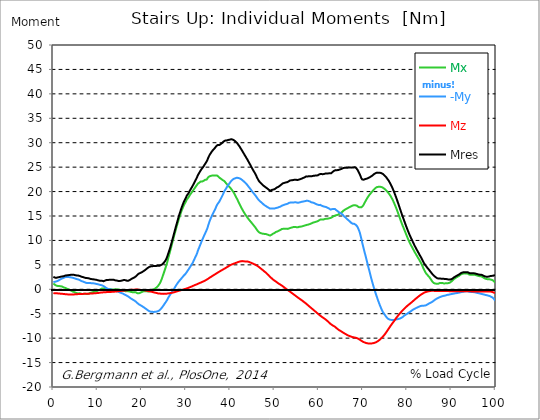
| Category |  Mx |  -My |  Mz |  Mres |
|---|---|---|---|---|
| 0.0 | 1.2 | 1.5 | -0.78 | 2.56 |
| 0.16678370786516855 | 1.06 | 1.51 | -0.78 | 2.47 |
| 0.3335674157303371 | 0.94 | 1.52 | -0.8 | 2.39 |
| 0.5003511235955057 | 0.83 | 1.56 | -0.81 | 2.36 |
| 0.6671348314606742 | 0.75 | 1.62 | -0.82 | 2.35 |
| 0.8339185393258427 | 0.7 | 1.66 | -0.83 | 2.38 |
| 1.0007022471910114 | 0.68 | 1.72 | -0.84 | 2.43 |
| 1.1674859550561796 | 0.67 | 1.79 | -0.85 | 2.46 |
| 1.3342696629213484 | 0.66 | 1.89 | -0.87 | 2.5 |
| 1.5010533707865168 | 0.65 | 2 | -0.89 | 2.54 |
| 1.6678370786516854 | 0.62 | 2.08 | -0.9 | 2.57 |
| 1.8346207865168538 | 0.6 | 2.15 | -0.92 | 2.6 |
| 2.001404494382023 | 0.56 | 2.22 | -0.93 | 2.63 |
| 2.1681882022471908 | 0.47 | 2.28 | -0.95 | 2.64 |
| 2.334971910112359 | 0.38 | 2.35 | -0.96 | 2.67 |
| 2.501755617977528 | 0.36 | 2.43 | -0.98 | 2.76 |
| 2.668539325842697 | 0.29 | 2.48 | -1 | 2.8 |
| 2.8353230337078656 | 0.2 | 2.51 | -1.02 | 2.83 |
| 3.0021067415730336 | 0.14 | 2.52 | -1.03 | 2.85 |
| 3.168890449438202 | 0.09 | 2.52 | -1.04 | 2.86 |
| 3.335674157303371 | 0.03 | 2.52 | -1.05 | 2.89 |
| 3.502457865168539 | -0.03 | 2.51 | -1.06 | 2.91 |
| 3.6692415730337076 | -0.11 | 2.48 | -1.07 | 2.92 |
| 3.8360252808988764 | -0.2 | 2.45 | -1.07 | 2.94 |
| 4.002808988764046 | -0.28 | 2.43 | -1.08 | 2.97 |
| 4.169592696629214 | -0.37 | 2.4 | -1.08 | 2.97 |
| 4.3363764044943816 | -0.45 | 2.37 | -1.07 | 2.97 |
| 4.50316011235955 | -0.51 | 2.33 | -1.06 | 2.98 |
| 4.669943820224718 | -0.55 | 2.28 | -1.05 | 2.96 |
| 4.836727528089888 | -0.59 | 2.21 | -1.03 | 2.91 |
| 5.003511235955056 | -0.68 | 2.16 | -1.02 | 2.87 |
| 5.170294943820225 | -0.76 | 2.12 | -1.01 | 2.84 |
| 5.337078651685394 | -0.81 | 2.08 | -1 | 2.83 |
| 5.5038623595505625 | -0.85 | 2.05 | -0.99 | 2.82 |
| 5.670646067415731 | -0.84 | 2 | -0.98 | 2.8 |
| 5.837429775280899 | -0.8 | 1.95 | -0.98 | 2.76 |
| 6.004213483146067 | -0.83 | 1.86 | -0.98 | 2.71 |
| 6.170997191011236 | -0.88 | 1.76 | -0.96 | 2.63 |
| 6.329002808988764 | -0.92 | 1.69 | -0.96 | 2.58 |
| 6.495786516853932 | -0.95 | 1.65 | -0.95 | 2.55 |
| 6.662570224719101 | -0.98 | 1.59 | -0.94 | 2.51 |
| 6.82935393258427 | -0.96 | 1.53 | -0.93 | 2.46 |
| 6.9961376404494375 | -0.92 | 1.47 | -0.93 | 2.4 |
| 7.162921348314607 | -0.9 | 1.41 | -0.92 | 2.35 |
| 7.329705056179775 | -0.93 | 1.34 | -0.91 | 2.31 |
| 7.496488764044945 | -0.97 | 1.27 | -0.91 | 2.29 |
| 7.663272471910113 | -0.96 | 1.27 | -0.9 | 2.29 |
| 7.830056179775281 | -0.93 | 1.26 | -0.9 | 2.27 |
| 7.996839887640449 | -0.89 | 1.27 | -0.9 | 2.25 |
| 8.16362359550562 | -0.8 | 1.27 | -0.89 | 2.18 |
| 8.330407303370787 | -0.74 | 1.27 | -0.88 | 2.14 |
| 8.497191011235955 | -0.69 | 1.26 | -0.87 | 2.11 |
| 8.663974719101123 | -0.65 | 1.25 | -0.86 | 2.08 |
| 8.830758426966291 | -0.61 | 1.24 | -0.85 | 2.06 |
| 8.99754213483146 | -0.57 | 1.23 | -0.84 | 2.05 |
| 9.16432584269663 | -0.52 | 1.21 | -0.83 | 2.01 |
| 9.331109550561798 | -0.49 | 1.18 | -0.82 | 1.99 |
| 9.497893258426966 | -0.46 | 1.15 | -0.81 | 1.98 |
| 9.664676966292134 | -0.43 | 1.11 | -0.79 | 1.96 |
| 9.831460674157304 | -0.36 | 1.09 | -0.78 | 1.93 |
| 9.998244382022472 | -0.28 | 1.05 | -0.77 | 1.86 |
| 10.16502808988764 | -0.23 | 1 | -0.75 | 1.83 |
| 10.331811797752808 | -0.16 | 0.96 | -0.73 | 1.78 |
| 10.498595505617978 | -0.08 | 0.92 | -0.71 | 1.75 |
| 10.665379213483147 | 0 | 0.88 | -0.68 | 1.74 |
| 10.832162921348315 | 0.09 | 0.85 | -0.67 | 1.75 |
| 10.998946629213483 | 0.16 | 0.81 | -0.65 | 1.74 |
| 11.165730337078653 | 0.21 | 0.75 | -0.63 | 1.68 |
| 11.33251404494382 | 0.18 | 0.66 | -0.62 | 1.64 |
| 11.49929775280899 | 0.18 | 0.57 | -0.61 | 1.69 |
| 11.666081460674157 | 0.2 | 0.46 | -0.6 | 1.78 |
| 11.832865168539326 | 0.17 | 0.35 | -0.59 | 1.84 |
| 11.999648876404493 | 0.12 | 0.24 | -0.58 | 1.89 |
| 12.166432584269662 | 0.05 | 0.14 | -0.57 | 1.9 |
| 12.333216292134832 | 0 | 0.08 | -0.58 | 1.91 |
| 12.5 | -0.01 | 0.02 | -0.57 | 1.92 |
| 12.66678370786517 | 0.01 | 0.02 | -0.57 | 1.94 |
| 12.833567415730336 | 0 | 0 | -0.56 | 1.96 |
| 13.000351123595506 | -0.01 | -0.03 | -0.54 | 1.97 |
| 13.167134831460674 | -0.03 | -0.07 | -0.53 | 1.93 |
| 13.333918539325843 | -0.05 | -0.12 | -0.52 | 1.96 |
| 13.500702247191011 | -0.06 | -0.17 | -0.51 | 1.98 |
| 13.667485955056181 | -0.07 | -0.21 | -0.5 | 1.94 |
| 13.834269662921349 | -0.04 | -0.27 | -0.49 | 1.88 |
| 14.001053370786519 | 0.01 | -0.32 | -0.47 | 1.83 |
| 14.167837078651687 | -0.03 | -0.37 | -0.46 | 1.8 |
| 14.334620786516853 | -0.04 | -0.41 | -0.44 | 1.79 |
| 14.501404494382026 | -0.03 | -0.44 | -0.42 | 1.75 |
| 14.668188202247192 | -0.02 | -0.47 | -0.4 | 1.71 |
| 14.834971910112362 | -0.04 | -0.53 | -0.38 | 1.69 |
| 15.001755617977528 | -0.08 | -0.62 | -0.36 | 1.7 |
| 15.168539325842698 | -0.15 | -0.69 | -0.35 | 1.72 |
| 15.335323033707864 | -0.23 | -0.76 | -0.33 | 1.74 |
| 15.502106741573034 | -0.27 | -0.81 | -0.32 | 1.76 |
| 15.6688904494382 | -0.29 | -0.86 | -0.3 | 1.83 |
| 15.83567415730337 | -0.3 | -0.97 | -0.29 | 1.92 |
| 16.00245786516854 | -0.32 | -1.03 | -0.27 | 1.91 |
| 16.16924157303371 | -0.37 | -1.1 | -0.26 | 1.9 |
| 16.336025280898877 | -0.4 | -1.18 | -0.24 | 1.85 |
| 16.502808988764045 | -0.36 | -1.25 | -0.22 | 1.77 |
| 16.669592696629216 | -0.37 | -1.34 | -0.2 | 1.75 |
| 16.83637640449438 | -0.39 | -1.43 | -0.18 | 1.74 |
| 17.003160112359552 | -0.41 | -1.53 | -0.16 | 1.77 |
| 17.169943820224717 | -0.45 | -1.64 | -0.15 | 1.84 |
| 17.336727528089888 | -0.48 | -1.75 | -0.13 | 1.93 |
| 17.503511235955056 | -0.52 | -1.86 | -0.12 | 2.02 |
| 17.670294943820224 | -0.56 | -1.96 | -0.1 | 2.12 |
| 17.837078651685395 | -0.6 | -2.06 | -0.1 | 2.22 |
| 18.003862359550563 | -0.61 | -2.14 | -0.08 | 2.29 |
| 18.17064606741573 | -0.59 | -2.23 | -0.08 | 2.36 |
| 18.3374297752809 | -0.58 | -2.31 | -0.07 | 2.43 |
| 18.504213483146067 | -0.58 | -2.42 | -0.06 | 2.53 |
| 18.662219101123597 | -0.63 | -2.54 | -0.05 | 2.65 |
| 18.829002808988765 | -0.72 | -2.68 | -0.05 | 2.8 |
| 18.995786516853933 | -0.81 | -2.83 | -0.06 | 2.97 |
| 19.1625702247191 | -0.84 | -2.96 | -0.08 | 3.1 |
| 19.32935393258427 | -0.83 | -3.07 | -0.09 | 3.21 |
| 19.49613764044944 | -0.78 | -3.16 | -0.1 | 3.28 |
| 19.662921348314608 | -0.71 | -3.25 | -0.12 | 3.35 |
| 19.829705056179776 | -0.63 | -3.33 | -0.13 | 3.42 |
| 19.996488764044944 | -0.56 | -3.42 | -0.14 | 3.49 |
| 20.163272471910112 | -0.49 | -3.52 | -0.15 | 3.59 |
| 20.33005617977528 | -0.43 | -3.62 | -0.16 | 3.68 |
| 20.49683988764045 | -0.4 | -3.72 | -0.18 | 3.78 |
| 20.663623595505616 | -0.38 | -3.83 | -0.21 | 3.89 |
| 20.830407303370787 | -0.37 | -3.93 | -0.24 | 4 |
| 20.997191011235955 | -0.38 | -4.05 | -0.27 | 4.12 |
| 21.163974719101123 | -0.41 | -4.17 | -0.3 | 4.25 |
| 21.330758426966295 | -0.44 | -4.28 | -0.33 | 4.37 |
| 21.497542134831463 | -0.44 | -4.38 | -0.37 | 4.47 |
| 21.66432584269663 | -0.43 | -4.47 | -0.4 | 4.57 |
| 21.8311095505618 | -0.4 | -4.55 | -0.44 | 4.65 |
| 21.997893258426966 | -0.33 | -4.58 | -0.47 | 4.68 |
| 22.164676966292134 | -0.25 | -4.59 | -0.49 | 4.7 |
| 22.331460674157306 | -0.16 | -4.6 | -0.53 | 4.72 |
| 22.498244382022467 | -0.09 | -4.62 | -0.58 | 4.74 |
| 22.66502808988764 | -0.02 | -4.64 | -0.62 | 4.76 |
| 22.831811797752806 | 0.07 | -4.63 | -0.65 | 4.76 |
| 22.99859550561798 | 0.15 | -4.61 | -0.69 | 4.76 |
| 23.165379213483146 | 0.25 | -4.61 | -0.72 | 4.77 |
| 23.332162921348313 | 0.37 | -4.57 | -0.76 | 4.79 |
| 23.49894662921348 | 0.52 | -4.53 | -0.8 | 4.8 |
| 23.665730337078653 | 0.68 | -4.48 | -0.84 | 4.81 |
| 23.83251404494382 | 0.87 | -4.44 | -0.87 | 4.83 |
| 23.999297752808985 | 1.11 | -4.3 | -0.87 | 4.82 |
| 24.166081460674157 | 1.37 | -4.18 | -0.89 | 4.87 |
| 24.332865168539325 | 1.72 | -3.99 | -0.9 | 4.97 |
| 24.499648876404496 | 2.1 | -3.79 | -0.91 | 5.07 |
| 24.666432584269664 | 2.53 | -3.61 | -0.93 | 5.13 |
| 24.833216292134832 | 2.97 | -3.41 | -0.94 | 5.26 |
| 25.0 | 3.42 | -3.17 | -0.94 | 5.45 |
| 25.16678370786517 | 3.87 | -2.95 | -0.94 | 5.62 |
| 25.33356741573034 | 4.32 | -2.73 | -0.92 | 5.88 |
| 25.500351123595504 | 4.79 | -2.51 | -0.91 | 6.15 |
| 25.66713483146067 | 5.29 | -2.27 | -0.89 | 6.5 |
| 25.833918539325843 | 5.85 | -1.99 | -0.87 | 6.92 |
| 26.00070224719101 | 6.44 | -1.7 | -0.84 | 7.37 |
| 26.16748595505618 | 7.01 | -1.45 | -0.82 | 7.82 |
| 26.334269662921347 | 7.57 | -1.22 | -0.8 | 8.27 |
| 26.50105337078652 | 8.14 | -0.99 | -0.77 | 8.78 |
| 26.667837078651687 | 8.73 | -0.74 | -0.74 | 9.33 |
| 26.834620786516858 | 9.33 | -0.52 | -0.71 | 9.87 |
| 27.001404494382022 | 9.92 | -0.29 | -0.68 | 10.43 |
| 27.16818820224719 | 10.48 | -0.07 | -0.64 | 10.99 |
| 27.334971910112362 | 11.06 | 0.16 | -0.6 | 11.57 |
| 27.50175561797753 | 11.61 | 0.41 | -0.56 | 12.13 |
| 27.668539325842698 | 12.15 | 0.68 | -0.51 | 12.69 |
| 27.835323033707866 | 12.7 | 0.92 | -0.46 | 13.24 |
| 28.002106741573037 | 13.23 | 1.14 | -0.41 | 13.77 |
| 28.168890449438205 | 13.74 | 1.36 | -0.36 | 14.31 |
| 28.335674157303373 | 14.26 | 1.56 | -0.32 | 14.84 |
| 28.502457865168537 | 14.75 | 1.74 | -0.27 | 15.34 |
| 28.669241573033705 | 15.2 | 1.91 | -0.23 | 15.81 |
| 28.836025280898877 | 15.67 | 2.09 | -0.19 | 16.28 |
| 29.002808988764052 | 16.09 | 2.28 | -0.14 | 16.72 |
| 29.169592696629213 | 16.45 | 2.45 | -0.09 | 17.12 |
| 29.336376404494384 | 16.82 | 2.64 | -0.05 | 17.51 |
| 29.50316011235955 | 17.17 | 2.82 | 0 | 17.9 |
| 29.669943820224724 | 17.47 | 2.96 | 0.04 | 18.22 |
| 29.836727528089884 | 17.75 | 3.11 | 0.08 | 18.51 |
| 30.003511235955056 | 18.02 | 3.28 | 0.12 | 18.79 |
| 30.170294943820224 | 18.37 | 3.53 | 0.17 | 19.16 |
| 30.337078651685395 | 18.56 | 3.76 | 0.23 | 19.37 |
| 30.503862359550563 | 18.75 | 3.98 | 0.28 | 19.58 |
| 30.670646067415728 | 18.98 | 4.2 | 0.34 | 19.84 |
| 30.837429775280903 | 19.25 | 4.45 | 0.4 | 20.15 |
| 30.99543539325843 | 19.47 | 4.68 | 0.47 | 20.4 |
| 31.162219101123597 | 19.67 | 4.94 | 0.52 | 20.67 |
| 31.32900280898876 | 19.88 | 5.16 | 0.59 | 20.92 |
| 31.495786516853936 | 20.1 | 5.41 | 0.66 | 21.19 |
| 31.6625702247191 | 20.32 | 5.73 | 0.73 | 21.48 |
| 31.82935393258427 | 20.55 | 6.05 | 0.8 | 21.77 |
| 31.996137640449433 | 20.76 | 6.39 | 0.87 | 22.07 |
| 32.162921348314605 | 20.97 | 6.7 | 0.93 | 22.36 |
| 32.329705056179776 | 21.17 | 7 | 0.98 | 22.64 |
| 32.49648876404494 | 21.39 | 7.38 | 1.05 | 22.97 |
| 32.66327247191011 | 21.61 | 7.87 | 1.12 | 23.35 |
| 32.83005617977528 | 21.71 | 8.26 | 1.19 | 23.6 |
| 32.996839887640455 | 21.83 | 8.63 | 1.25 | 23.86 |
| 33.16362359550562 | 21.97 | 8.99 | 1.32 | 24.12 |
| 33.330407303370784 | 22.07 | 9.37 | 1.38 | 24.37 |
| 33.497191011235955 | 22.08 | 9.79 | 1.44 | 24.6 |
| 33.66397471910113 | 22.07 | 10.15 | 1.51 | 24.78 |
| 33.83075842696629 | 22.12 | 10.46 | 1.57 | 24.98 |
| 33.997542134831455 | 22.22 | 10.81 | 1.65 | 25.22 |
| 34.164325842696634 | 22.31 | 11.15 | 1.73 | 25.46 |
| 34.3311095505618 | 22.42 | 11.46 | 1.8 | 25.7 |
| 34.49789325842697 | 22.45 | 11.81 | 1.89 | 25.92 |
| 34.66467696629213 | 22.45 | 12.14 | 1.97 | 26.11 |
| 34.831460674157306 | 22.64 | 12.53 | 2.06 | 26.45 |
| 34.99824438202247 | 22.92 | 13.04 | 2.16 | 26.89 |
| 35.16502808988764 | 23.04 | 13.51 | 2.27 | 27.21 |
| 35.331811797752806 | 23.14 | 13.95 | 2.38 | 27.51 |
| 35.49859550561798 | 23.17 | 14.33 | 2.47 | 27.73 |
| 35.66537921348315 | 23.22 | 14.69 | 2.56 | 27.97 |
| 35.83216292134831 | 23.29 | 15.02 | 2.66 | 28.21 |
| 35.998946629213485 | 23.31 | 15.34 | 2.76 | 28.4 |
| 36.16573033707865 | 23.32 | 15.64 | 2.85 | 28.57 |
| 36.33251404494382 | 23.3 | 15.97 | 2.94 | 28.74 |
| 36.499297752808985 | 23.28 | 16.25 | 3.03 | 28.9 |
| 36.666081460674164 | 23.28 | 16.57 | 3.13 | 29.09 |
| 36.83286516853932 | 23.3 | 16.95 | 3.23 | 29.3 |
| 36.99964887640449 | 23.3 | 17.26 | 3.32 | 29.46 |
| 37.166432584269664 | 23.19 | 17.51 | 3.42 | 29.54 |
| 37.333216292134836 | 23.03 | 17.7 | 3.51 | 29.53 |
| 37.5 | 22.87 | 17.9 | 3.61 | 29.52 |
| 37.666783707865164 | 22.76 | 18.18 | 3.69 | 29.61 |
| 37.833567415730336 | 22.66 | 18.48 | 3.78 | 29.72 |
| 38.00035112359551 | 22.55 | 18.78 | 3.86 | 29.85 |
| 38.16713483146068 | 22.42 | 19.08 | 3.95 | 29.95 |
| 38.333918539325836 | 22.32 | 19.38 | 4.04 | 30.07 |
| 38.50070224719101 | 22.26 | 19.74 | 4.13 | 30.26 |
| 38.66748595505618 | 22.15 | 20.08 | 4.21 | 30.4 |
| 38.83426966292135 | 21.97 | 20.32 | 4.3 | 30.43 |
| 39.001053370786515 | 21.76 | 20.55 | 4.39 | 30.42 |
| 39.16783707865169 | 21.56 | 20.81 | 4.47 | 30.44 |
| 39.33462078651686 | 21.41 | 21.04 | 4.57 | 30.49 |
| 39.50140449438202 | 21.24 | 21.32 | 4.66 | 30.56 |
| 39.668188202247194 | 21.08 | 21.48 | 4.76 | 30.57 |
| 39.83497191011236 | 20.92 | 21.69 | 4.85 | 30.61 |
| 40.00175561797753 | 20.77 | 21.89 | 4.94 | 30.66 |
| 40.168539325842694 | 20.6 | 22.11 | 5.01 | 30.71 |
| 40.335323033707866 | 20.38 | 22.29 | 5.08 | 30.69 |
| 40.50210674157304 | 20.17 | 22.42 | 5.15 | 30.66 |
| 40.6688904494382 | 19.95 | 22.53 | 5.2 | 30.6 |
| 40.83567415730337 | 19.71 | 22.62 | 5.26 | 30.52 |
| 41.00245786516854 | 19.44 | 22.68 | 5.31 | 30.4 |
| 41.16924157303371 | 19.13 | 22.74 | 5.36 | 30.25 |
| 41.33602528089887 | 18.83 | 22.81 | 5.42 | 30.11 |
| 41.502808988764045 | 18.55 | 22.83 | 5.49 | 29.97 |
| 41.669592696629216 | 18.25 | 22.81 | 5.54 | 29.77 |
| 41.83637640449439 | 17.93 | 22.78 | 5.6 | 29.56 |
| 42.00316011235955 | 17.62 | 22.75 | 5.65 | 29.35 |
| 42.16994382022472 | 17.31 | 22.68 | 5.69 | 29.12 |
| 42.33672752808989 | 17.01 | 22.6 | 5.73 | 28.88 |
| 42.50351123595506 | 16.7 | 22.5 | 5.76 | 28.63 |
| 42.670294943820224 | 16.43 | 22.39 | 5.77 | 28.38 |
| 42.83707865168539 | 16.16 | 22.26 | 5.75 | 28.13 |
| 43.00386235955057 | 15.89 | 22.13 | 5.74 | 27.87 |
| 43.17064606741573 | 15.64 | 21.99 | 5.72 | 27.62 |
| 43.32865168539326 | 15.4 | 21.84 | 5.7 | 27.36 |
| 43.495435393258425 | 15.16 | 21.7 | 5.69 | 27.11 |
| 43.6622191011236 | 14.95 | 21.53 | 5.68 | 26.85 |
| 43.82900280898876 | 14.74 | 21.37 | 5.67 | 26.61 |
| 43.99578651685393 | 14.53 | 21.18 | 5.66 | 26.33 |
| 44.162570224719104 | 14.33 | 20.97 | 5.64 | 26.05 |
| 44.32935393258427 | 14.14 | 20.78 | 5.57 | 25.78 |
| 44.49613764044944 | 13.95 | 20.59 | 5.5 | 25.51 |
| 44.66292134831461 | 13.78 | 20.38 | 5.43 | 25.22 |
| 44.82970505617978 | 13.6 | 20.17 | 5.37 | 24.94 |
| 44.99648876404493 | 13.41 | 19.96 | 5.31 | 24.66 |
| 45.16327247191011 | 13.22 | 19.77 | 5.25 | 24.39 |
| 45.33005617977528 | 13.04 | 19.59 | 5.17 | 24.13 |
| 45.49683988764045 | 12.86 | 19.43 | 5.1 | 23.89 |
| 45.66362359550561 | 12.65 | 19.22 | 5.03 | 23.6 |
| 45.83040730337079 | 12.44 | 19.02 | 4.95 | 23.3 |
| 45.99719101123596 | 12.21 | 18.8 | 4.86 | 22.98 |
| 46.16397471910113 | 12.01 | 18.59 | 4.77 | 22.68 |
| 46.33075842696629 | 11.81 | 18.37 | 4.66 | 22.38 |
| 46.497542134831455 | 11.67 | 18.2 | 4.53 | 22.14 |
| 46.66432584269663 | 11.57 | 18.07 | 4.42 | 21.96 |
| 46.83110955056179 | 11.51 | 17.93 | 4.3 | 21.8 |
| 46.99789325842696 | 11.46 | 17.8 | 4.18 | 21.65 |
| 47.164676966292134 | 11.42 | 17.66 | 4.06 | 21.5 |
| 47.331460674157306 | 11.38 | 17.53 | 3.94 | 21.34 |
| 47.49824438202247 | 11.36 | 17.39 | 3.81 | 21.21 |
| 47.66502808988764 | 11.34 | 17.26 | 3.68 | 21.07 |
| 47.83181179775281 | 11.33 | 17.16 | 3.56 | 20.98 |
| 47.99859550561797 | 11.32 | 17.06 | 3.45 | 20.88 |
| 48.16537921348314 | 11.28 | 16.97 | 3.31 | 20.77 |
| 48.33216292134831 | 11.22 | 16.87 | 3.17 | 20.65 |
| 48.498946629213485 | 11.16 | 16.78 | 3.02 | 20.53 |
| 48.66573033707865 | 11.11 | 16.69 | 2.87 | 20.42 |
| 48.83251404494382 | 11.05 | 16.6 | 2.7 | 20.29 |
| 48.99929775280899 | 11 | 16.51 | 2.53 | 20.17 |
| 49.166081460674164 | 11.05 | 16.5 | 2.39 | 20.19 |
| 49.33286516853933 | 11.16 | 16.53 | 2.27 | 20.28 |
| 49.499648876404486 | 11.29 | 16.57 | 2.13 | 20.38 |
| 49.666432584269664 | 11.38 | 16.56 | 2 | 20.42 |
| 49.83321629213483 | 11.45 | 16.52 | 1.88 | 20.42 |
| 50.0 | 11.53 | 16.54 | 1.77 | 20.48 |
| 50.166783707865164 | 11.62 | 16.59 | 1.67 | 20.58 |
| 50.33356741573034 | 11.74 | 16.63 | 1.57 | 20.71 |
| 50.50035112359551 | 11.84 | 16.67 | 1.47 | 20.82 |
| 50.66713483146068 | 11.83 | 16.7 | 1.34 | 20.86 |
| 50.83391853932584 | 11.9 | 16.74 | 1.22 | 20.95 |
| 51.00070224719101 | 11.99 | 16.82 | 1.13 | 21.08 |
| 51.16748595505618 | 12.06 | 16.86 | 1.04 | 21.16 |
| 51.33426966292134 | 12.14 | 16.92 | 0.95 | 21.26 |
| 51.50105337078652 | 12.23 | 17.02 | 0.85 | 21.4 |
| 51.66783707865169 | 12.34 | 17.11 | 0.75 | 21.54 |
| 51.83462078651686 | 12.41 | 17.19 | 0.64 | 21.66 |
| 52.00140449438202 | 12.38 | 17.22 | 0.53 | 21.68 |
| 52.168188202247194 | 12.41 | 17.29 | 0.41 | 21.76 |
| 52.33497191011236 | 12.41 | 17.34 | 0.3 | 21.82 |
| 52.50175561797752 | 12.41 | 17.39 | 0.18 | 21.86 |
| 52.668539325842694 | 12.4 | 17.43 | 0.06 | 21.9 |
| 52.835323033707866 | 12.36 | 17.47 | -0.05 | 21.92 |
| 53.00210674157304 | 12.36 | 17.52 | -0.15 | 21.96 |
| 53.1688904494382 | 12.41 | 17.61 | -0.26 | 22.07 |
| 53.33567415730337 | 12.47 | 17.71 | -0.37 | 22.2 |
| 53.502457865168545 | 12.54 | 17.77 | -0.47 | 22.28 |
| 53.669241573033716 | 12.58 | 17.76 | -0.59 | 22.29 |
| 53.83602528089887 | 12.62 | 17.75 | -0.7 | 22.3 |
| 54.002808988764045 | 12.66 | 17.75 | -0.82 | 22.32 |
| 54.169592696629216 | 12.71 | 17.75 | -0.93 | 22.35 |
| 54.33637640449438 | 12.75 | 17.76 | -1.04 | 22.37 |
| 54.50316011235955 | 12.76 | 17.8 | -1.15 | 22.42 |
| 54.669943820224724 | 12.76 | 17.83 | -1.26 | 22.46 |
| 54.836727528089895 | 12.73 | 17.79 | -1.37 | 22.43 |
| 55.00351123595506 | 12.7 | 17.77 | -1.5 | 22.42 |
| 55.17029494382022 | 12.67 | 17.71 | -1.61 | 22.36 |
| 55.337078651685395 | 12.71 | 17.71 | -1.72 | 22.38 |
| 55.50386235955056 | 12.78 | 17.74 | -1.83 | 22.44 |
| 55.66186797752809 | 12.81 | 17.78 | -1.93 | 22.49 |
| 55.82865168539326 | 12.82 | 17.82 | -2.04 | 22.54 |
| 55.995435393258425 | 12.83 | 17.87 | -2.15 | 22.6 |
| 56.1622191011236 | 12.86 | 17.91 | -2.26 | 22.66 |
| 56.32900280898877 | 12.9 | 17.94 | -2.36 | 22.72 |
| 56.49578651685393 | 12.95 | 17.97 | -2.48 | 22.79 |
| 56.6625702247191 | 13.01 | 18 | -2.6 | 22.85 |
| 56.82935393258427 | 13.05 | 18.03 | -2.71 | 22.93 |
| 56.99613764044943 | 13.1 | 18.06 | -2.83 | 23 |
| 57.16292134831461 | 13.17 | 18.13 | -2.94 | 23.11 |
| 57.329705056179776 | 13.18 | 18.15 | -3.08 | 23.13 |
| 57.49648876404495 | 13.2 | 18.1 | -3.22 | 23.1 |
| 57.66327247191011 | 13.25 | 18.08 | -3.35 | 23.12 |
| 57.83005617977529 | 13.3 | 18.04 | -3.47 | 23.13 |
| 57.99683988764044 | 13.36 | 17.98 | -3.6 | 23.13 |
| 58.16362359550561 | 13.43 | 17.9 | -3.73 | 23.14 |
| 58.33040730337079 | 13.47 | 17.8 | -3.86 | 23.11 |
| 58.497191011235955 | 13.56 | 17.77 | -3.98 | 23.16 |
| 58.66397471910112 | 13.64 | 17.75 | -4.11 | 23.23 |
| 58.83075842696629 | 13.68 | 17.68 | -4.24 | 23.23 |
| 58.99754213483147 | 13.72 | 17.63 | -4.37 | 23.25 |
| 59.164325842696634 | 13.76 | 17.58 | -4.49 | 23.27 |
| 59.33110955056179 | 13.8 | 17.47 | -4.62 | 23.25 |
| 59.49789325842697 | 13.84 | 17.4 | -4.75 | 23.27 |
| 59.664676966292134 | 13.91 | 17.35 | -4.88 | 23.3 |
| 59.8314606741573 | 13.98 | 17.29 | -5.01 | 23.35 |
| 59.99824438202247 | 14.06 | 17.25 | -5.14 | 23.41 |
| 60.16502808988765 | 14.19 | 17.29 | -5.27 | 23.54 |
| 60.33181179775281 | 14.26 | 17.28 | -5.39 | 23.61 |
| 60.49859550561798 | 14.28 | 17.2 | -5.5 | 23.61 |
| 60.66537921348315 | 14.27 | 17.11 | -5.61 | 23.58 |
| 60.83216292134831 | 14.27 | 17.04 | -5.72 | 23.56 |
| 60.99894662921348 | 14.27 | 16.99 | -5.82 | 23.56 |
| 61.16573033707864 | 14.3 | 16.94 | -5.93 | 23.58 |
| 61.33251404494383 | 14.37 | 16.9 | -6.03 | 23.64 |
| 61.49929775280899 | 14.41 | 16.87 | -6.15 | 23.69 |
| 61.66608146067416 | 14.44 | 16.84 | -6.26 | 23.72 |
| 61.83286516853932 | 14.45 | 16.77 | -6.38 | 23.72 |
| 61.99964887640451 | 14.46 | 16.68 | -6.52 | 23.72 |
| 62.16643258426967 | 14.47 | 16.59 | -6.67 | 23.72 |
| 62.33321629213482 | 14.52 | 16.54 | -6.8 | 23.74 |
| 62.5 | 14.56 | 16.44 | -6.94 | 23.75 |
| 62.66678370786517 | 14.6 | 16.31 | -7.08 | 23.73 |
| 62.833567415730336 | 14.65 | 16.25 | -7.21 | 23.76 |
| 63.0003511235955 | 14.73 | 16.4 | -7.3 | 23.93 |
| 63.16713483146068 | 14.84 | 16.38 | -7.41 | 24.04 |
| 63.33391853932585 | 14.95 | 16.44 | -7.49 | 24.18 |
| 63.500702247191015 | 15.02 | 16.45 | -7.57 | 24.27 |
| 63.66748595505618 | 15.07 | 16.42 | -7.66 | 24.33 |
| 63.83426966292135 | 15.14 | 16.32 | -7.79 | 24.39 |
| 64.00105337078651 | 15.17 | 16.17 | -7.93 | 24.37 |
| 64.16783707865169 | 15.21 | 16.06 | -8.05 | 24.38 |
| 64.33462078651687 | 15.25 | 15.96 | -8.18 | 24.4 |
| 64.50140449438203 | 15.33 | 15.83 | -8.29 | 24.43 |
| 64.6681882022472 | 15.45 | 15.68 | -8.4 | 24.48 |
| 64.83497191011236 | 15.55 | 15.6 | -8.48 | 24.55 |
| 65.00175561797754 | 15.62 | 15.56 | -8.56 | 24.6 |
| 65.16853932584269 | 15.73 | 15.44 | -8.66 | 24.64 |
| 65.33532303370787 | 15.85 | 15.34 | -8.75 | 24.71 |
| 65.50210674157304 | 16.02 | 15.16 | -8.87 | 24.79 |
| 65.66889044943821 | 16.15 | 14.99 | -8.96 | 24.84 |
| 65.83567415730337 | 16.25 | 14.86 | -9.04 | 24.87 |
| 66.00245786516854 | 16.34 | 14.74 | -9.12 | 24.9 |
| 66.1692415730337 | 16.43 | 14.58 | -9.21 | 24.9 |
| 66.33602528089888 | 16.51 | 14.44 | -9.3 | 24.9 |
| 66.50280898876404 | 16.59 | 14.3 | -9.4 | 24.89 |
| 66.66959269662921 | 16.67 | 14.17 | -9.47 | 24.89 |
| 66.83637640449439 | 16.76 | 14.06 | -9.53 | 24.91 |
| 67.00316011235955 | 16.84 | 13.91 | -9.58 | 24.92 |
| 67.16994382022472 | 16.92 | 13.76 | -9.64 | 24.92 |
| 67.33672752808988 | 16.99 | 13.61 | -9.69 | 24.91 |
| 67.50351123595506 | 17.07 | 13.48 | -9.75 | 24.9 |
| 67.67029494382022 | 17.15 | 13.42 | -9.8 | 24.93 |
| 67.83707865168539 | 17.17 | 13.38 | -9.82 | 24.92 |
| 67.99508426966291 | 17.2 | 13.4 | -9.85 | 24.95 |
| 68.16186797752809 | 17.25 | 13.33 | -9.9 | 24.98 |
| 68.32865168539327 | 17.18 | 13.23 | -9.92 | 24.89 |
| 68.49543539325843 | 17.13 | 13.09 | -9.96 | 24.79 |
| 68.6622191011236 | 17.09 | 12.91 | -10.01 | 24.66 |
| 68.82900280898876 | 16.93 | 12.64 | -10.09 | 24.36 |
| 68.99578651685394 | 16.83 | 12.3 | -10.16 | 24.05 |
| 69.1625702247191 | 16.77 | 11.91 | -10.24 | 23.74 |
| 69.32935393258425 | 16.77 | 11.45 | -10.34 | 23.43 |
| 69.49613764044945 | 16.75 | 10.86 | -10.44 | 23.05 |
| 69.66292134831461 | 16.77 | 10.21 | -10.55 | 22.69 |
| 69.82970505617978 | 16.88 | 9.54 | -10.65 | 22.48 |
| 69.99648876404494 | 17.07 | 8.91 | -10.73 | 22.42 |
| 70.16327247191012 | 17.33 | 8.33 | -10.81 | 22.43 |
| 70.33005617977528 | 17.61 | 7.7 | -10.87 | 22.48 |
| 70.49683988764045 | 17.91 | 7.16 | -10.93 | 22.56 |
| 70.66362359550561 | 18.18 | 6.55 | -10.98 | 22.59 |
| 70.83040730337079 | 18.45 | 5.94 | -11.03 | 22.63 |
| 70.99719101123596 | 18.71 | 5.34 | -11.06 | 22.68 |
| 71.16397471910112 | 18.94 | 4.76 | -11.07 | 22.75 |
| 71.3307584269663 | 19.16 | 4.17 | -11.09 | 22.83 |
| 71.49754213483146 | 19.37 | 3.59 | -11.09 | 22.92 |
| 71.66432584269663 | 19.56 | 3.01 | -11.1 | 23.03 |
| 71.83110955056179 | 19.72 | 2.4 | -11.1 | 23.09 |
| 71.99789325842697 | 19.9 | 1.82 | -11.08 | 23.18 |
| 72.16467696629215 | 20.09 | 1.28 | -11.06 | 23.31 |
| 72.3314606741573 | 20.27 | 0.77 | -11.03 | 23.45 |
| 72.49824438202248 | 20.44 | 0.23 | -10.99 | 23.57 |
| 72.66502808988764 | 20.59 | -0.25 | -10.95 | 23.66 |
| 72.8318117977528 | 20.73 | -0.72 | -10.88 | 23.75 |
| 72.99859550561797 | 20.84 | -1.17 | -10.81 | 23.84 |
| 73.16537921348315 | 20.92 | -1.62 | -10.73 | 23.88 |
| 73.33216292134833 | 20.96 | -2.07 | -10.65 | 23.89 |
| 73.49894662921349 | 20.97 | -2.48 | -10.54 | 23.87 |
| 73.66573033707864 | 20.99 | -2.88 | -10.42 | 23.87 |
| 73.83251404494382 | 20.99 | -3.28 | -10.29 | 23.85 |
| 73.99929775280899 | 20.96 | -3.64 | -10.15 | 23.81 |
| 74.16608146067415 | 20.93 | -4.01 | -10 | 23.77 |
| 74.33286516853933 | 20.89 | -4.36 | -9.85 | 23.72 |
| 74.49964887640449 | 20.81 | -4.64 | -9.69 | 23.62 |
| 74.66643258426967 | 20.7 | -4.88 | -9.52 | 23.49 |
| 74.83321629213484 | 20.58 | -5.1 | -9.34 | 23.34 |
| 75.0 | 20.45 | -5.29 | -9.15 | 23.19 |
| 75.16678370786516 | 20.32 | -5.51 | -8.95 | 23.03 |
| 75.33356741573033 | 20.16 | -5.72 | -8.72 | 22.84 |
| 75.5003511235955 | 19.99 | -5.92 | -8.49 | 22.63 |
| 75.66713483146067 | 19.82 | -6.04 | -8.28 | 22.43 |
| 75.83391853932585 | 19.63 | -6.13 | -8.04 | 22.2 |
| 76.00070224719101 | 19.42 | -6.19 | -7.82 | 21.94 |
| 76.16748595505618 | 19.19 | -6.23 | -7.59 | 21.66 |
| 76.33426966292136 | 18.96 | -6.26 | -7.37 | 21.37 |
| 76.50105337078652 | 18.68 | -6.28 | -7.16 | 21.06 |
| 76.66783707865167 | 18.39 | -6.27 | -6.96 | 20.73 |
| 76.83462078651685 | 18.08 | -6.27 | -6.76 | 20.38 |
| 77.00140449438202 | 17.76 | -6.27 | -6.55 | 20.02 |
| 77.1681882022472 | 17.4 | -6.24 | -6.34 | 19.62 |
| 77.33497191011236 | 17.03 | -6.2 | -6.13 | 19.21 |
| 77.50175561797754 | 16.66 | -6.18 | -5.9 | 18.8 |
| 77.6685393258427 | 16.28 | -6.14 | -5.7 | 18.38 |
| 77.83532303370787 | 15.87 | -6.11 | -5.51 | 17.94 |
| 78.00210674157303 | 15.46 | -6.07 | -5.32 | 17.5 |
| 78.1688904494382 | 15.03 | -6.04 | -5.14 | 17.05 |
| 78.33567415730337 | 14.59 | -6 | -4.97 | 16.59 |
| 78.50245786516854 | 14.17 | -5.94 | -4.79 | 16.14 |
| 78.66924157303372 | 13.75 | -5.86 | -4.62 | 15.69 |
| 78.83602528089888 | 13.36 | -5.76 | -4.45 | 15.26 |
| 79.00280898876404 | 12.96 | -5.66 | -4.29 | 14.83 |
| 79.16959269662921 | 12.61 | -5.52 | -4.14 | 14.42 |
| 79.33637640449439 | 12.24 | -5.39 | -3.99 | 14.01 |
| 79.50316011235955 | 11.86 | -5.28 | -3.84 | 13.59 |
| 79.66994382022472 | 11.47 | -5.19 | -3.69 | 13.17 |
| 79.8367275280899 | 11.1 | -5.09 | -3.55 | 12.77 |
| 80.00351123595506 | 10.72 | -5.01 | -3.41 | 12.37 |
| 80.17029494382022 | 10.36 | -4.91 | -3.28 | 11.99 |
| 80.32830056179776 | 10.02 | -4.79 | -3.16 | 11.61 |
| 80.49508426966293 | 9.68 | -4.68 | -3.04 | 11.24 |
| 80.66186797752809 | 9.38 | -4.59 | -2.93 | 10.9 |
| 80.82865168539325 | 9.08 | -4.49 | -2.8 | 10.57 |
| 80.99543539325842 | 8.8 | -4.38 | -2.67 | 10.25 |
| 81.1622191011236 | 8.52 | -4.28 | -2.54 | 9.93 |
| 81.32900280898878 | 8.23 | -4.16 | -2.42 | 9.6 |
| 81.49578651685394 | 7.95 | -4.09 | -2.28 | 9.28 |
| 81.6625702247191 | 7.66 | -4 | -2.14 | 8.96 |
| 81.82935393258427 | 7.41 | -3.91 | -2.01 | 8.67 |
| 81.99613764044945 | 7.15 | -3.84 | -1.88 | 8.39 |
| 82.16292134831461 | 6.89 | -3.77 | -1.76 | 8.11 |
| 82.32970505617978 | 6.62 | -3.7 | -1.64 | 7.83 |
| 82.49648876404494 | 6.37 | -3.62 | -1.52 | 7.55 |
| 82.66327247191012 | 6.13 | -3.56 | -1.39 | 7.29 |
| 82.83005617977528 | 5.85 | -3.5 | -1.28 | 7 |
| 82.99683988764045 | 5.61 | -3.43 | -1.17 | 6.74 |
| 83.16362359550563 | 5.33 | -3.39 | -1.07 | 6.47 |
| 83.33040730337079 | 5.01 | -3.37 | -0.97 | 6.18 |
| 83.49719101123596 | 4.66 | -3.36 | -0.88 | 5.88 |
| 83.66397471910112 | 4.3 | -3.35 | -0.8 | 5.58 |
| 83.8307584269663 | 3.97 | -3.35 | -0.7 | 5.31 |
| 83.99754213483146 | 3.68 | -3.34 | -0.63 | 5.08 |
| 84.16432584269663 | 3.4 | -3.32 | -0.57 | 4.87 |
| 84.33110955056179 | 3.19 | -3.24 | -0.52 | 4.67 |
| 84.49789325842697 | 3.01 | -3.14 | -0.48 | 4.47 |
| 84.66467696629213 | 2.84 | -3.05 | -0.44 | 4.29 |
| 84.8314606741573 | 2.67 | -2.96 | -0.41 | 4.11 |
| 84.99824438202248 | 2.5 | -2.88 | -0.39 | 3.92 |
| 85.16502808988764 | 2.29 | -2.81 | -0.36 | 3.72 |
| 85.3318117977528 | 2.07 | -2.73 | -0.33 | 3.52 |
| 85.49859550561797 | 1.83 | -2.65 | -0.32 | 3.33 |
| 85.66537921348315 | 1.6 | -2.57 | -0.31 | 3.14 |
| 85.83216292134831 | 1.42 | -2.46 | -0.31 | 2.97 |
| 85.99894662921348 | 1.3 | -2.34 | -0.32 | 2.82 |
| 86.16573033707866 | 1.23 | -2.22 | -0.33 | 2.68 |
| 86.33251404494384 | 1.17 | -2.11 | -0.34 | 2.55 |
| 86.499297752809 | 1.19 | -2 | -0.35 | 2.44 |
| 86.66608146067415 | 1.14 | -1.92 | -0.35 | 2.34 |
| 86.83286516853933 | 1.1 | -1.84 | -0.35 | 2.24 |
| 86.99964887640449 | 1.11 | -1.77 | -0.36 | 2.19 |
| 87.16643258426966 | 1.2 | -1.7 | -0.35 | 2.21 |
| 87.33321629213482 | 1.28 | -1.63 | -0.35 | 2.22 |
| 87.5 | 1.27 | -1.56 | -0.35 | 2.19 |
| 87.66678370786518 | 1.26 | -1.5 | -0.34 | 2.17 |
| 87.83356741573033 | 1.25 | -1.45 | -0.33 | 2.16 |
| 88.00035112359551 | 1.28 | -1.41 | -0.33 | 2.19 |
| 88.16713483146067 | 1.25 | -1.38 | -0.34 | 2.17 |
| 88.33391853932584 | 1.19 | -1.33 | -0.34 | 2.12 |
| 88.500702247191 | 1.18 | -1.29 | -0.35 | 2.1 |
| 88.66748595505618 | 1.22 | -1.27 | -0.35 | 2.13 |
| 88.83426966292136 | 1.22 | -1.23 | -0.36 | 2.1 |
| 89.00105337078652 | 1.21 | -1.16 | -0.37 | 2.05 |
| 89.16783707865169 | 1.23 | -1.14 | -0.37 | 2.03 |
| 89.33462078651687 | 1.27 | -1.11 | -0.38 | 2.02 |
| 89.50140449438203 | 1.31 | -1.08 | -0.38 | 2 |
| 89.6681882022472 | 1.36 | -1.04 | -0.39 | 1.98 |
| 89.83497191011236 | 1.49 | -1 | -0.39 | 2.02 |
| 90.00175561797754 | 1.6 | -0.98 | -0.39 | 2.06 |
| 90.16853932584269 | 1.72 | -0.95 | -0.4 | 2.13 |
| 90.33532303370787 | 1.87 | -0.92 | -0.4 | 2.23 |
| 90.50210674157303 | 2.04 | -0.88 | -0.4 | 2.38 |
| 90.6688904494382 | 2.16 | -0.86 | -0.4 | 2.48 |
| 90.83567415730336 | 2.27 | -0.83 | -0.4 | 2.57 |
| 91.00245786516854 | 2.37 | -0.8 | -0.4 | 2.66 |
| 91.1692415730337 | 2.46 | -0.78 | -0.4 | 2.75 |
| 91.33602528089888 | 2.55 | -0.76 | -0.4 | 2.83 |
| 91.50280898876404 | 2.64 | -0.73 | -0.41 | 2.92 |
| 91.66959269662922 | 2.71 | -0.71 | -0.42 | 3 |
| 91.83637640449439 | 2.81 | -0.67 | -0.43 | 3.09 |
| 92.00316011235955 | 2.95 | -0.62 | -0.43 | 3.22 |
| 92.16994382022472 | 3.06 | -0.58 | -0.42 | 3.32 |
| 92.3367275280899 | 3.13 | -0.55 | -0.42 | 3.39 |
| 92.50351123595506 | 3.17 | -0.53 | -0.42 | 3.43 |
| 92.66151685393258 | 3.21 | -0.5 | -0.42 | 3.47 |
| 92.82830056179776 | 3.25 | -0.47 | -0.42 | 3.51 |
| 92.99508426966291 | 3.26 | -0.45 | -0.41 | 3.52 |
| 93.16186797752809 | 3.25 | -0.42 | -0.4 | 3.51 |
| 93.32865168539325 | 3.24 | -0.4 | -0.4 | 3.5 |
| 93.49543539325842 | 3.24 | -0.4 | -0.41 | 3.5 |
| 93.66221910112358 | 3.23 | -0.4 | -0.41 | 3.49 |
| 93.82900280898876 | 3.18 | -0.41 | -0.41 | 3.44 |
| 93.99578651685393 | 3.02 | -0.51 | -0.41 | 3.3 |
| 94.1625702247191 | 2.96 | -0.57 | -0.41 | 3.27 |
| 94.32935393258427 | 2.97 | -0.56 | -0.42 | 3.28 |
| 94.49613764044945 | 2.97 | -0.57 | -0.43 | 3.27 |
| 94.66292134831461 | 3 | -0.56 | -0.44 | 3.3 |
| 94.82970505617978 | 2.99 | -0.56 | -0.44 | 3.28 |
| 94.99648876404494 | 2.98 | -0.58 | -0.44 | 3.28 |
| 95.16327247191012 | 2.97 | -0.6 | -0.45 | 3.26 |
| 95.33005617977528 | 2.95 | -0.62 | -0.45 | 3.24 |
| 95.49683988764046 | 2.91 | -0.66 | -0.45 | 3.2 |
| 95.66362359550563 | 2.87 | -0.7 | -0.45 | 3.16 |
| 95.83040730337078 | 2.81 | -0.74 | -0.45 | 3.11 |
| 95.99719101123594 | 2.76 | -0.77 | -0.45 | 3.05 |
| 96.16397471910112 | 2.71 | -0.81 | -0.45 | 3.01 |
| 96.33075842696628 | 2.69 | -0.84 | -0.46 | 3 |
| 96.49754213483145 | 2.68 | -0.88 | -0.46 | 2.99 |
| 96.66432584269663 | 2.66 | -0.92 | -0.46 | 2.97 |
| 96.8311095505618 | 2.62 | -0.95 | -0.47 | 2.95 |
| 96.99789325842697 | 2.54 | -0.99 | -0.47 | 2.89 |
| 97.16467696629213 | 2.44 | -1.02 | -0.46 | 2.81 |
| 97.3314606741573 | 2.33 | -1.07 | -0.45 | 2.73 |
| 97.49824438202248 | 2.23 | -1.11 | -0.44 | 2.65 |
| 97.66502808988764 | 2.17 | -1.15 | -0.44 | 2.61 |
| 97.8318117977528 | 2.13 | -1.18 | -0.44 | 2.59 |
| 97.99859550561798 | 2.09 | -1.22 | -0.44 | 2.58 |
| 98.16537921348316 | 2.05 | -1.26 | -0.43 | 2.56 |
| 98.33216292134833 | 2.03 | -1.3 | -0.43 | 2.58 |
| 98.49894662921349 | 2.03 | -1.33 | -0.44 | 2.62 |
| 98.66573033707866 | 2.03 | -1.38 | -0.44 | 2.67 |
| 98.8325140449438 | 2 | -1.47 | -0.46 | 2.71 |
| 98.99929775280897 | 1.96 | -1.55 | -0.5 | 2.73 |
| 99.16608146067416 | 1.91 | -1.62 | -0.53 | 2.75 |
| 99.33286516853933 | 1.87 | -1.7 | -0.57 | 2.78 |
| 99.49964887640449 | 1.72 | -1.85 | -0.64 | 2.78 |
| 99.66643258426966 | 1.58 | -2.03 | -0.71 | 2.83 |
| 99.83321629213484 | 1.46 | -2.21 | -0.78 | 2.93 |
| 100.0 | 1.34 | -2.39 | -0.85 | 3.03 |